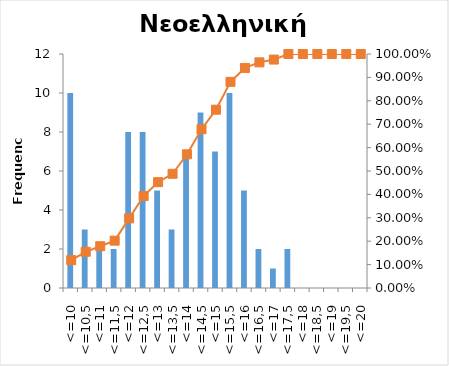
| Category | Series 0 |
|---|---|
| <=10 | 10 |
| <=10,5 | 3 |
| <=11 | 2 |
| <=11,5 | 2 |
| <=12 | 8 |
| <=12,5 | 8 |
| <=13 | 5 |
| <=13,5 | 3 |
| <=14 | 7 |
| <=14,5 | 9 |
| <=15 | 7 |
| <=15,5 | 10 |
| <=16 | 5 |
| <=16,5 | 2 |
| <=17 | 1 |
| <=17,5 | 2 |
| <=18 | 0 |
| <=18,5 | 0 |
| <=19 | 0 |
| <=19,5 | 0 |
| <=20 | 0 |